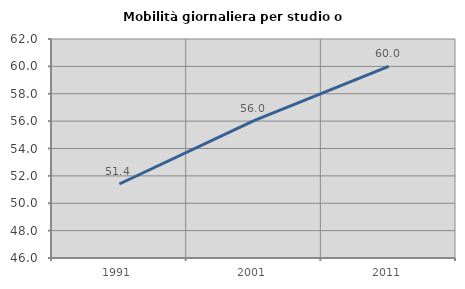
| Category | Mobilità giornaliera per studio o lavoro |
|---|---|
| 1991.0 | 51.406 |
| 2001.0 | 56.044 |
| 2011.0 | 60 |